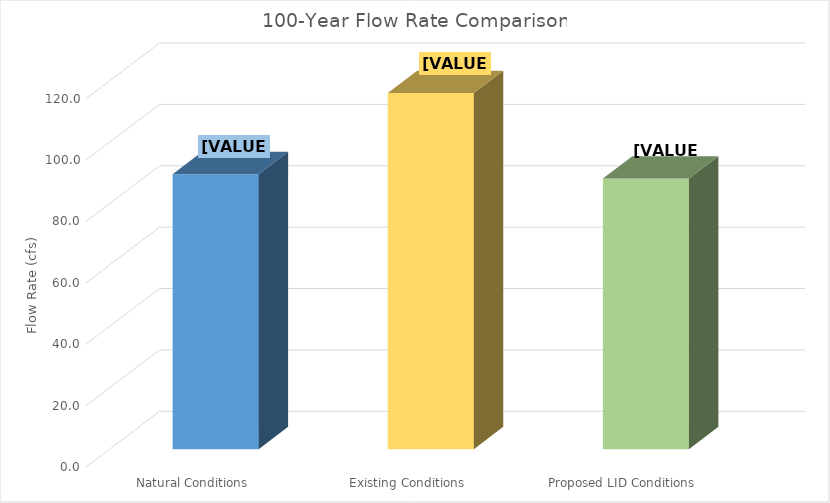
| Category | 100-Year Flow Rate (cfs) |
|---|---|
| Natural Conditions | 89.6 |
| Existing Conditions | 116 |
| Proposed LID Conditions | 88.2 |